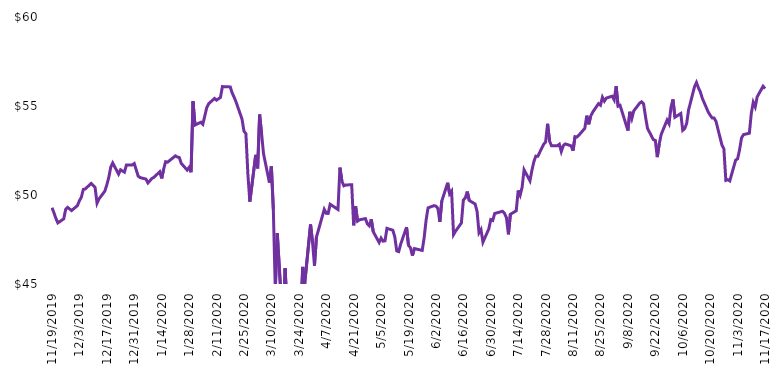
| Category | 49.630272 |
|---|---|
| 11/19/19 | 49.284 |
| 11/20/19 | 49.004 |
| 11/21/19 | 48.686 |
| 11/22/19 | 48.433 |
| 11/25/19 | 48.658 |
| 11/26/19 | 49.2 |
| 11/27/19 | 49.303 |
| 11/29/19 | 49.125 |
| 12/2/19 | 49.406 |
| 12/3/19 | 49.677 |
| 12/4/19 | 49.873 |
| 12/5/19 | 50.313 |
| 12/6/19 | 50.341 |
| 12/9/19 | 50.649 |
| 12/10/19 | 50.547 |
| 12/11/19 | 50.425 |
| 12/12/19 | 49.537 |
| 12/13/19 | 49.78 |
| 12/16/19 | 50.219 |
| 12/17/19 | 50.575 |
| 12/18/19 | 50.986 |
| 12/19/19 | 51.566 |
| 12/20/19 | 51.799 |
| 12/23/19 | 51.173 |
| 12/24/19 | 51.416 |
| 12/26/19 | 51.285 |
| 12/27/19 | 51.687 |
| 12/30/19 | 51.692 |
| 12/31/19 | 51.767 |
| 1/2/20 | 51.062 |
| 1/3/20 | 50.978 |
| 1/6/20 | 50.893 |
| 1/7/20 | 50.677 |
| 1/8/20 | 50.799 |
| 1/9/20 | 50.931 |
| 1/10/20 | 50.987 |
| 1/13/20 | 51.307 |
| 1/14/20 | 50.931 |
| 1/15/20 | 51.448 |
| 1/16/20 | 51.871 |
| 1/17/20 | 51.842 |
| 1/21/20 | 52.2 |
| 1/22/20 | 52.134 |
| 1/23/20 | 52.106 |
| 1/24/20 | 51.777 |
| 1/27/20 | 51.401 |
| 1/28/20 | 51.551 |
| 1/29/20 | 51.278 |
| 1/30/20 | 55.263 |
| 1/31/20 | 53.929 |
| 2/3/20 | 54.089 |
| 2/4/20 | 53.976 |
| 2/5/20 | 54.436 |
| 2/6/20 | 54.906 |
| 2/7/20 | 55.132 |
| 2/10/20 | 55.423 |
| 2/11/20 | 55.329 |
| 2/12/20 | 55.404 |
| 2/13/20 | 55.48 |
| 2/14/20 | 56.09 |
| 2/18/20 | 56.072 |
| 2/19/20 | 55.733 |
| 2/20/20 | 55.489 |
| 2/21/20 | 55.216 |
| 2/24/20 | 54.267 |
| 2/25/20 | 53.59 |
| 2/26/20 | 53.44 |
| 2/27/20 | 51.184 |
| 2/28/20 | 49.624 |
| 3/2/20 | 52.256 |
| 3/3/20 | 51.495 |
| 3/4/20 | 54.521 |
| 3/5/20 | 53.44 |
| 3/6/20 | 52.312 |
| 3/9/20 | 50.696 |
| 3/10/20 | 51.607 |
| 3/11/20 | 49.192 |
| 3/12/20 | 44.652 |
| 3/13/20 | 47.857 |
| 3/16/20 | 42.387 |
| 3/17/20 | 45.884 |
| 3/18/20 | 43.75 |
| 3/19/20 | 42.735 |
| 3/20/20 | 40.714 |
| 3/23/20 | 39.408 |
| 3/24/20 | 43.854 |
| 3/25/20 | 43.337 |
| 3/26/20 | 45.959 |
| 3/27/20 | 45.01 |
| 3/30/20 | 48.342 |
| 3/31/20 | 47.35 |
| 4/1/20 | 46.026 |
| 4/2/20 | 47.633 |
| 4/3/20 | 48.021 |
| 4/6/20 | 49.193 |
| 4/7/20 | 48.976 |
| 4/8/20 | 48.966 |
| 4/9/20 | 49.486 |
| 4/13/20 | 49.184 |
| 4/14/20 | 51.538 |
| 4/15/20 | 50.782 |
| 4/16/20 | 50.517 |
| 4/17/20 | 50.564 |
| 4/20/20 | 50.574 |
| 4/21/20 | 48.295 |
| 4/22/20 | 49.373 |
| 4/23/20 | 48.532 |
| 4/24/20 | 48.607 |
| 4/27/20 | 48.673 |
| 4/28/20 | 48.38 |
| 4/29/20 | 48.267 |
| 4/30/20 | 48.636 |
| 5/1/20 | 47.936 |
| 5/4/20 | 47.331 |
| 5/5/20 | 47.577 |
| 5/6/20 | 47.406 |
| 5/7/20 | 47.425 |
| 5/8/20 | 48.125 |
| 5/11/20 | 48.021 |
| 5/12/20 | 47.652 |
| 5/13/20 | 46.858 |
| 5/14/20 | 46.82 |
| 5/15/20 | 47.236 |
| 5/18/20 | 48.191 |
| 5/19/20 | 47.17 |
| 5/20/20 | 47.038 |
| 5/21/20 | 46.593 |
| 5/22/20 | 46.99 |
| 5/26/20 | 46.886 |
| 5/27/20 | 47.605 |
| 5/28/20 | 48.607 |
| 5/29/20 | 49.278 |
| 6/1/20 | 49.401 |
| 6/2/20 | 49.373 |
| 6/3/20 | 49.25 |
| 6/4/20 | 48.494 |
| 6/5/20 | 49.666 |
| 6/8/20 | 50.687 |
| 6/9/20 | 50.063 |
| 6/10/20 | 50.214 |
| 6/11/20 | 47.775 |
| 6/12/20 | 47.964 |
| 6/15/20 | 48.428 |
| 6/16/20 | 49.713 |
| 6/17/20 | 49.836 |
| 6/18/20 | 50.196 |
| 6/19/20 | 49.694 |
| 6/22/20 | 49.496 |
| 6/23/20 | 49.089 |
| 6/24/20 | 47.879 |
| 6/25/20 | 48.059 |
| 6/26/20 | 47.35 |
| 6/29/20 | 48.096 |
| 6/30/20 | 48.619 |
| 7/1/20 | 48.572 |
| 7/2/20 | 48.961 |
| 7/6/20 | 49.085 |
| 7/7/20 | 48.971 |
| 7/8/20 | 48.724 |
| 7/9/20 | 47.792 |
| 7/10/20 | 48.914 |
| 7/13/20 | 49.114 |
| 7/14/20 | 50.255 |
| 7/15/20 | 49.988 |
| 7/16/20 | 50.435 |
| 7/17/20 | 51.415 |
| 7/20/20 | 50.797 |
| 7/21/20 | 51.386 |
| 7/22/20 | 51.871 |
| 7/23/20 | 52.185 |
| 7/24/20 | 52.175 |
| 7/27/20 | 52.851 |
| 7/28/20 | 52.974 |
| 7/29/20 | 54.001 |
| 7/30/20 | 53.031 |
| 7/31/20 | 52.765 |
| 8/3/20 | 52.765 |
| 8/4/20 | 52.851 |
| 8/5/20 | 52.442 |
| 8/6/20 | 52.765 |
| 8/7/20 | 52.87 |
| 8/10/20 | 52.765 |
| 8/11/20 | 52.489 |
| 8/12/20 | 53.278 |
| 8/13/20 | 53.259 |
| 8/14/20 | 53.364 |
| 8/17/20 | 53.744 |
| 8/18/20 | 54.458 |
| 8/19/20 | 53.973 |
| 8/20/20 | 54.429 |
| 8/21/20 | 54.648 |
| 8/24/20 | 55.133 |
| 8/25/20 | 55.047 |
| 8/26/20 | 55.494 |
| 8/27/20 | 55.275 |
| 8/28/20 | 55.447 |
| 8/31/20 | 55.551 |
| 9/1/20 | 55.342 |
| 9/2/20 | 56.112 |
| 9/3/20 | 54.99 |
| 9/4/20 | 55.038 |
| 9/8/20 | 53.621 |
| 9/9/20 | 54.676 |
| 9/10/20 | 54.296 |
| 9/11/20 | 54.724 |
| 9/14/20 | 55.161 |
| 9/15/20 | 55.237 |
| 9/16/20 | 55.123 |
| 9/17/20 | 54.401 |
| 9/18/20 | 53.744 |
| 9/21/20 | 53.107 |
| 9/22/20 | 53.069 |
| 9/23/20 | 52.128 |
| 9/24/20 | 52.879 |
| 9/25/20 | 53.402 |
| 9/28/20 | 54.21 |
| 9/29/20 | 54.005 |
| 9/30/20 | 54.932 |
| 10/1/20 | 55.372 |
| 10/2/20 | 54.368 |
| 10/5/20 | 54.578 |
| 10/6/20 | 53.632 |
| 10/7/20 | 53.728 |
| 10/8/20 | 54.024 |
| 10/9/20 | 54.789 |
| 10/12/20 | 56.08 |
| 10/13/20 | 56.319 |
| 10/14/20 | 56.022 |
| 10/15/20 | 55.783 |
| 10/16/20 | 55.43 |
| 10/19/20 | 54.665 |
| 10/20/20 | 54.483 |
| 10/21/20 | 54.33 |
| 10/22/20 | 54.33 |
| 10/23/20 | 54.129 |
| 10/26/20 | 52.81 |
| 10/27/20 | 52.599 |
| 10/28/20 | 50.821 |
| 10/29/20 | 50.859 |
| 10/30/20 | 50.792 |
| 11/2/20 | 51.959 |
| 11/3/20 | 52.035 |
| 11/4/20 | 52.532 |
| 11/5/20 | 53.202 |
| 11/6/20 | 53.393 |
| 11/9/20 | 53.469 |
| 11/10/20 | 54.588 |
| 11/11/20 | 55.21 |
| 11/12/20 | 54.951 |
| 11/13/20 | 55.516 |
| 11/16/20 | 56.108 |
| 11/17/20 | 55.975 |